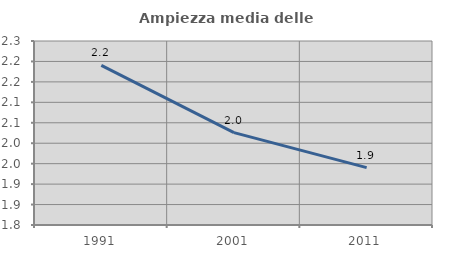
| Category | Ampiezza media delle famiglie |
|---|---|
| 1991.0 | 2.19 |
| 2001.0 | 2.026 |
| 2011.0 | 1.94 |